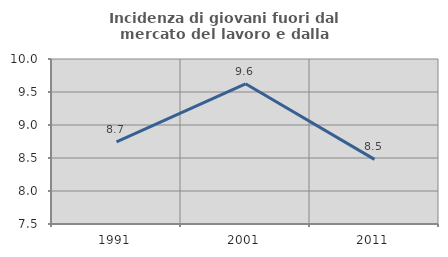
| Category | Incidenza di giovani fuori dal mercato del lavoro e dalla formazione  |
|---|---|
| 1991.0 | 8.743 |
| 2001.0 | 9.625 |
| 2011.0 | 8.48 |